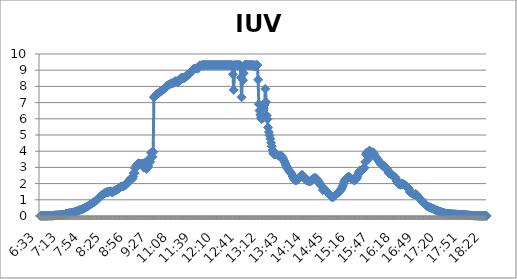
| Category | IUV (01/5) |
|---|---|
| 0.27291666666666664 | 0.009 |
| 0.2736111111111111 | 0.009 |
| 0.2743055555555555 | 0.009 |
| 0.275 | 0.009 |
| 0.27569444444444446 | 0.009 |
| 0.27638888888888885 | 0.009 |
| 0.27708333333333335 | 0.009 |
| 0.2777777777777778 | 0.009 |
| 0.27847222222222223 | 0.009 |
| 0.2791666666666667 | 0.009 |
| 0.2798611111111111 | 0.009 |
| 0.28055555555555556 | 0.019 |
| 0.28125 | 0.019 |
| 0.28194444444444444 | 0.019 |
| 0.2826388888888889 | 0.019 |
| 0.2833333333333333 | 0.019 |
| 0.28402777777777777 | 0.019 |
| 0.2847222222222222 | 0.019 |
| 0.28541666666666665 | 0.019 |
| 0.28611111111111115 | 0.028 |
| 0.2923611111111111 | 0.037 |
| 0.29305555555555557 | 0.047 |
| 0.29375 | 0.047 |
| 0.29444444444444445 | 0.047 |
| 0.2951388888888889 | 0.047 |
| 0.29583333333333334 | 0.056 |
| 0.2972222222222222 | 0.056 |
| 0.29791666666666666 | 0.065 |
| 0.2986111111111111 | 0.065 |
| 0.29930555555555555 | 0.075 |
| 0.3 | 0.075 |
| 0.30069444444444443 | 0.075 |
| 0.3013888888888889 | 0.084 |
| 0.3020833333333333 | 0.084 |
| 0.30277777777777776 | 0.084 |
| 0.3090277777777778 | 0.14 |
| 0.30972222222222223 | 0.149 |
| 0.3104166666666667 | 0.149 |
| 0.3111111111111111 | 0.158 |
| 0.31180555555555556 | 0.168 |
| 0.3125 | 0.177 |
| 0.31319444444444444 | 0.177 |
| 0.3138888888888889 | 0.186 |
| 0.3145833333333333 | 0.196 |
| 0.31527777777777777 | 0.205 |
| 0.3159722222222222 | 0.214 |
| 0.31666666666666665 | 0.224 |
| 0.31736111111111115 | 0.233 |
| 0.31805555555555554 | 0.252 |
| 0.3201388888888889 | 0.28 |
| 0.32083333333333336 | 0.289 |
| 0.3215277777777778 | 0.298 |
| 0.32222222222222224 | 0.317 |
| 0.3229166666666667 | 0.336 |
| 0.3236111111111111 | 0.354 |
| 0.32430555555555557 | 0.373 |
| 0.325 | 0.391 |
| 0.32569444444444445 | 0.401 |
| 0.3263888888888889 | 0.419 |
| 0.32708333333333334 | 0.438 |
| 0.3277777777777778 | 0.457 |
| 0.3284722222222222 | 0.485 |
| 0.32916666666666666 | 0.503 |
| 0.3298611111111111 | 0.531 |
| 0.33055555555555555 | 0.55 |
| 0.33125 | 0.578 |
| 0.33194444444444443 | 0.606 |
| 0.3326388888888889 | 0.634 |
| 0.3333333333333333 | 0.662 |
| 0.3340277777777778 | 0.699 |
| 0.3347222222222222 | 0.727 |
| 0.3354166666666667 | 0.755 |
| 0.3361111111111111 | 0.783 |
| 0.3368055555555556 | 0.811 |
| 0.3375 | 0.839 |
| 0.33819444444444446 | 0.876 |
| 0.33888888888888885 | 0.904 |
| 0.33958333333333335 | 0.932 |
| 0.34027777777777773 | 0.96 |
| 0.34097222222222223 | 1.007 |
| 0.3416666666666666 | 1.062 |
| 0.3423611111111111 | 1.109 |
| 0.3430555555555555 | 1.156 |
| 0.34375 | 1.193 |
| 0.3444444444444445 | 1.24 |
| 0.3451388888888889 | 1.277 |
| 0.3458333333333334 | 1.305 |
| 0.34652777777777777 | 1.333 |
| 0.34722222222222227 | 1.351 |
| 0.34791666666666665 | 1.389 |
| 0.34861111111111115 | 1.426 |
| 0.34930555555555554 | 1.445 |
| 0.35 | 1.463 |
| 0.3506944444444444 | 1.491 |
| 0.3513888888888889 | 1.473 |
| 0.3520833333333333 | 1.473 |
| 0.3527777777777778 | 1.501 |
| 0.3534722222222222 | 1.528 |
| 0.3541666666666667 | 1.519 |
| 0.3548611111111111 | 1.482 |
| 0.35555555555555557 | 1.473 |
| 0.35625 | 1.482 |
| 0.35694444444444445 | 1.51 |
| 0.3576388888888889 | 1.556 |
| 0.35833333333333334 | 1.575 |
| 0.3590277777777778 | 1.603 |
| 0.3597222222222222 | 1.622 |
| 0.36041666666666666 | 1.622 |
| 0.3611111111111111 | 1.65 |
| 0.36180555555555555 | 1.715 |
| 0.3625 | 1.734 |
| 0.36319444444444443 | 1.78 |
| 0.3638888888888889 | 1.808 |
| 0.3645833333333333 | 1.836 |
| 0.3652777777777778 | 1.817 |
| 0.3659722222222222 | 1.817 |
| 0.3666666666666667 | 1.845 |
| 0.3673611111111111 | 1.883 |
| 0.3680555555555556 | 1.911 |
| 0.36875 | 1.929 |
| 0.36944444444444446 | 1.957 |
| 0.37013888888888885 | 2.078 |
| 0.37083333333333335 | 2.116 |
| 0.37152777777777773 | 2.144 |
| 0.37222222222222223 | 2.19 |
| 0.3729166666666666 | 2.283 |
| 0.3736111111111111 | 2.321 |
| 0.3743055555555555 | 2.274 |
| 0.375 | 2.302 |
| 0.3756944444444445 | 2.423 |
| 0.3763888888888889 | 2.647 |
| 0.3770833333333334 | 2.638 |
| 0.37777777777777777 | 2.936 |
| 0.37847222222222227 | 3.076 |
| 0.37916666666666665 | 3.094 |
| 0.37986111111111115 | 3.197 |
| 0.38055555555555554 | 3.243 |
| 0.38125 | 3.253 |
| 0.3819444444444444 | 3.197 |
| 0.3826388888888889 | 3.178 |
| 0.3833333333333333 | 3.234 |
| 0.3840277777777778 | 3.178 |
| 0.3847222222222222 | 3.234 |
| 0.3854166666666667 | 3.253 |
| 0.3861111111111111 | 2.982 |
| 0.38680555555555557 | 3.271 |
| 0.3875 | 3.029 |
| 0.38819444444444445 | 2.936 |
| 0.3888888888888889 | 2.908 |
| 0.38958333333333334 | 2.982 |
| 0.3902777777777778 | 3.085 |
| 0.3909722222222222 | 3.467 |
| 0.39166666666666666 | 3.551 |
| 0.3923611111111111 | 3.346 |
| 0.39305555555555555 | 3.905 |
| 0.39375 | 3.886 |
| 0.39444444444444443 | 3.653 |
| 0.3951388888888889 | 3.961 |
| 0.4444444444444444 | 7.335 |
| 0.4451388888888889 | 7.372 |
| 0.4458333333333333 | 7.4 |
| 0.4465277777777778 | 7.456 |
| 0.4472222222222222 | 7.512 |
| 0.4479166666666667 | 7.559 |
| 0.4486111111111111 | 7.577 |
| 0.44930555555555557 | 7.596 |
| 0.45 | 7.661 |
| 0.45069444444444445 | 7.68 |
| 0.4513888888888889 | 7.698 |
| 0.45208333333333334 | 7.745 |
| 0.4527777777777778 | 7.773 |
| 0.4534722222222222 | 7.801 |
| 0.45416666666666666 | 7.857 |
| 0.4548611111111111 | 7.894 |
| 0.45555555555555555 | 7.931 |
| 0.45625 | 7.969 |
| 0.45694444444444443 | 8.006 |
| 0.4576388888888889 | 8.052 |
| 0.4583333333333333 | 8.09 |
| 0.4590277777777778 | 8.108 |
| 0.4597222222222222 | 8.127 |
| 0.4604166666666667 | 8.155 |
| 0.4611111111111111 | 8.192 |
| 0.4618055555555556 | 8.192 |
| 0.4625 | 8.183 |
| 0.46319444444444446 | 8.22 |
| 0.46388888888888885 | 8.258 |
| 0.46458333333333335 | 8.295 |
| 0.46527777777777773 | 8.323 |
| 0.46597222222222223 | 8.313 |
| 0.4666666666666666 | 8.313 |
| 0.4673611111111111 | 8.285 |
| 0.4680555555555555 | 8.267 |
| 0.46875 | 8.304 |
| 0.4694444444444445 | 8.369 |
| 0.4701388888888889 | 8.472 |
| 0.4708333333333334 | 8.528 |
| 0.47152777777777777 | 8.546 |
| 0.47222222222222227 | 8.537 |
| 0.47291666666666665 | 8.518 |
| 0.47361111111111115 | 8.509 |
| 0.47430555555555554 | 8.537 |
| 0.475 | 8.565 |
| 0.4756944444444444 | 8.602 |
| 0.4763888888888889 | 8.677 |
| 0.4770833333333333 | 8.742 |
| 0.4777777777777778 | 8.77 |
| 0.4784722222222222 | 8.751 |
| 0.4791666666666667 | 8.798 |
| 0.4798611111111111 | 8.891 |
| 0.48055555555555557 | 8.938 |
| 0.48125 | 8.975 |
| 0.48194444444444445 | 9.012 |
| 0.4826388888888889 | 9.059 |
| 0.48333333333333334 | 9.087 |
| 0.4840277777777778 | 9.106 |
| 0.4847222222222222 | 9.096 |
| 0.48541666666666666 | 9.115 |
| 0.4861111111111111 | 9.124 |
| 0.48680555555555555 | 9.096 |
| 0.4875 | 9.124 |
| 0.48819444444444443 | 9.255 |
| 0.4888888888888889 | 9.301 |
| 0.4895833333333333 | 9.283 |
| 0.4902777777777778 | 9.292 |
| 0.4909722222222222 | 9.32 |
| 0.4916666666666667 | 9.32 |
| 0.4923611111111111 | 9.32 |
| 0.4930555555555556 | 9.32 |
| 0.49375 | 9.32 |
| 0.49444444444444446 | 9.32 |
| 0.49513888888888885 | 9.32 |
| 0.49583333333333335 | 9.32 |
| 0.49652777777777773 | 9.32 |
| 0.49722222222222223 | 9.32 |
| 0.4979166666666666 | 9.32 |
| 0.4986111111111111 | 9.32 |
| 0.4993055555555555 | 9.32 |
| 0.5 | 9.32 |
| 0.5006944444444444 | 9.32 |
| 0.5013888888888889 | 9.32 |
| 0.5020833333333333 | 9.32 |
| 0.5027777777777778 | 9.32 |
| 0.5034722222222222 | 9.32 |
| 0.5041666666666667 | 9.32 |
| 0.5048611111111111 | 9.32 |
| 0.5055555555555555 | 9.32 |
| 0.50625 | 9.32 |
| 0.5069444444444444 | 9.32 |
| 0.5076388888888889 | 9.32 |
| 0.5083333333333333 | 9.32 |
| 0.5090277777777777 | 9.32 |
| 0.5097222222222222 | 9.32 |
| 0.5104166666666666 | 9.32 |
| 0.5111111111111112 | 9.32 |
| 0.5118055555555555 | 9.32 |
| 0.5125 | 9.32 |
| 0.5131944444444444 | 9.32 |
| 0.513888888888889 | 9.32 |
| 0.5145833333333333 | 9.32 |
| 0.5152777777777778 | 9.32 |
| 0.5159722222222222 | 9.32 |
| 0.5166666666666667 | 9.32 |
| 0.517361111111111 | 9.32 |
| 0.5180555555555556 | 9.32 |
| 0.51875 | 9.32 |
| 0.5194444444444445 | 9.32 |
| 0.5201388888888888 | 9.32 |
| 0.5208333333333334 | 8.751 |
| 0.5215277777777778 | 7.782 |
| 0.5222222222222223 | 9.32 |
| 0.5229166666666667 | 9.32 |
| 0.5236111111111111 | 9.32 |
| 0.5243055555555556 | 9.32 |
| 0.525 | 9.32 |
| 0.5256944444444445 | 9.32 |
| 0.5263888888888889 | 9.32 |
| 0.5270833333333333 | 9.32 |
| 0.5277777777777778 | 9.32 |
| 0.5284722222222222 | 8.546 |
| 0.5291666666666667 | 7.335 |
| 0.5298611111111111 | 9.208 |
| 0.5305555555555556 | 8.379 |
| 0.53125 | 8.807 |
| 0.5319444444444444 | 9.32 |
| 0.5326388888888889 | 9.32 |
| 0.5333333333333333 | 9.32 |
| 0.5340277777777778 | 9.32 |
| 0.5347222222222222 | 9.32 |
| 0.5354166666666667 | 9.32 |
| 0.5361111111111111 | 9.32 |
| 0.5368055555555555 | 9.32 |
| 0.5375 | 9.32 |
| 0.5381944444444444 | 9.32 |
| 0.5388888888888889 | 9.32 |
| 0.5395833333333333 | 9.32 |
| 0.5402777777777777 | 9.32 |
| 0.5409722222222222 | 9.32 |
| 0.5416666666666666 | 9.217 |
| 0.5423611111111112 | 9.227 |
| 0.5430555555555555 | 9.32 |
| 0.54375 | 9.32 |
| 0.5444444444444444 | 9.32 |
| 0.545138888888889 | 8.407 |
| 0.5458333333333333 | 6.906 |
| 0.5465277777777778 | 6.505 |
| 0.5472222222222222 | 6.244 |
| 0.5479166666666667 | 6.086 |
| 0.548611111111111 | 5.974 |
| 0.5493055555555556 | 6.039 |
| 0.55 | 6.878 |
| 0.5506944444444445 | 6.645 |
| 0.5513888888888888 | 6.85 |
| 0.5520833333333334 | 7.847 |
| 0.5527777777777778 | 7.037 |
| 0.5534722222222223 | 6.207 |
| 0.5541666666666667 | 5.974 |
| 0.5548611111111111 | 5.462 |
| 0.5555555555555556 | 5.182 |
| 0.55625 | 4.977 |
| 0.5569444444444445 | 4.772 |
| 0.5576388888888889 | 4.52 |
| 0.5583333333333333 | 4.306 |
| 0.5590277777777778 | 4.073 |
| 0.5597222222222222 | 3.886 |
| 0.5604166666666667 | 3.812 |
| 0.5611111111111111 | 3.812 |
| 0.5618055555555556 | 3.831 |
| 0.5625 | 3.831 |
| 0.5631944444444444 | 3.812 |
| 0.5638888888888889 | 3.765 |
| 0.5645833333333333 | 3.728 |
| 0.5652777777777778 | 3.7 |
| 0.5659722222222222 | 3.7 |
| 0.5666666666666667 | 3.728 |
| 0.5673611111111111 | 3.737 |
| 0.5680555555555555 | 3.691 |
| 0.56875 | 3.607 |
| 0.5694444444444444 | 3.514 |
| 0.5701388888888889 | 3.42 |
| 0.5708333333333333 | 3.318 |
| 0.5715277777777777 | 3.215 |
| 0.5722222222222222 | 3.122 |
| 0.5729166666666666 | 3.029 |
| 0.5736111111111112 | 2.945 |
| 0.5743055555555555 | 2.88 |
| 0.575 | 2.815 |
| 0.5756944444444444 | 2.749 |
| 0.576388888888889 | 2.693 |
| 0.5770833333333333 | 2.638 |
| 0.5777777777777778 | 2.563 |
| 0.5784722222222222 | 2.47 |
| 0.5791666666666667 | 2.367 |
| 0.579861111111111 | 2.283 |
| 0.5805555555555556 | 2.227 |
| 0.58125 | 2.2 |
| 0.5819444444444445 | 2.2 |
| 0.5826388888888888 | 2.227 |
| 0.5833333333333334 | 2.255 |
| 0.5840277777777778 | 2.293 |
| 0.5847222222222223 | 2.349 |
| 0.5854166666666667 | 2.405 |
| 0.5861111111111111 | 2.47 |
| 0.5868055555555556 | 2.516 |
| 0.5875 | 2.526 |
| 0.5881944444444445 | 2.516 |
| 0.5888888888888889 | 2.46 |
| 0.5895833333333333 | 2.395 |
| 0.5902777777777778 | 2.311 |
| 0.5909722222222222 | 2.246 |
| 0.5916666666666667 | 2.209 |
| 0.5923611111111111 | 2.19 |
| 0.5930555555555556 | 2.172 |
| 0.59375 | 2.162 |
| 0.5944444444444444 | 2.144 |
| 0.5951388888888889 | 2.134 |
| 0.5958333333333333 | 2.144 |
| 0.5965277777777778 | 2.181 |
| 0.5972222222222222 | 2.227 |
| 0.5979166666666667 | 2.274 |
| 0.5986111111111111 | 2.311 |
| 0.5993055555555555 | 2.339 |
| 0.6 | 2.349 |
| 0.6006944444444444 | 2.339 |
| 0.6013888888888889 | 2.311 |
| 0.6020833333333333 | 2.265 |
| 0.6027777777777777 | 2.2 |
| 0.6034722222222222 | 2.125 |
| 0.6041666666666666 | 2.041 |
| 0.6048611111111112 | 1.976 |
| 0.6055555555555555 | 1.911 |
| 0.60625 | 1.855 |
| 0.6069444444444444 | 1.808 |
| 0.607638888888889 | 1.603 |
| 0.6083333333333333 | 1.734 |
| 0.6090277777777778 | 1.687 |
| 0.6097222222222222 | 1.64 |
| 0.6104166666666667 | 1.594 |
| 0.611111111111111 | 1.538 |
| 0.6118055555555556 | 1.491 |
| 0.6125 | 1.445 |
| 0.6131944444444445 | 1.389 |
| 0.6138888888888888 | 1.333 |
| 0.6145833333333334 | 1.277 |
| 0.6152777777777778 | 1.221 |
| 0.6159722222222223 | 1.184 |
| 0.6166666666666667 | 1.165 |
| 0.6173611111111111 | 1.165 |
| 0.6180555555555556 | 1.184 |
| 0.61875 | 1.221 |
| 0.6194444444444445 | 1.258 |
| 0.6201388888888889 | 1.305 |
| 0.6208333333333333 | 1.351 |
| 0.6215277777777778 | 1.389 |
| 0.6222222222222222 | 1.426 |
| 0.6229166666666667 | 1.463 |
| 0.6236111111111111 | 1.51 |
| 0.6243055555555556 | 1.556 |
| 0.625 | 1.612 |
| 0.6256944444444444 | 1.687 |
| 0.6263888888888889 | 1.78 |
| 0.6270833333333333 | 1.892 |
| 0.6277777777777778 | 2.013 |
| 0.6284722222222222 | 2.125 |
| 0.6291666666666667 | 2.218 |
| 0.6298611111111111 | 2.293 |
| 0.6305555555555555 | 2.339 |
| 0.63125 | 2.377 |
| 0.6319444444444444 | 2.405 |
| 0.6326388888888889 | 2.414 |
| 0.6333333333333333 | 2.405 |
| 0.6340277777777777 | 2.367 |
| 0.6347222222222222 | 2.33 |
| 0.6354166666666666 | 2.293 |
| 0.6361111111111112 | 2.265 |
| 0.6368055555555555 | 2.246 |
| 0.6375 | 2.227 |
| 0.6381944444444444 | 2.209 |
| 0.638888888888889 | 2.218 |
| 0.6395833333333333 | 2.255 |
| 0.6402777777777778 | 2.311 |
| 0.6409722222222222 | 2.423 |
| 0.6416666666666667 | 2.554 |
| 0.642361111111111 | 2.693 |
| 0.6430555555555556 | 2.777 |
| 0.64375 | 2.815 |
| 0.6444444444444445 | 2.805 |
| 0.6451388888888888 | 2.805 |
| 0.6458333333333334 | 2.843 |
| 0.6465277777777778 | 2.899 |
| 0.6472222222222223 | 2.945 |
| 0.6479166666666667 | 2.982 |
| 0.6486111111111111 | 3.337 |
| 0.6493055555555556 | 3.793 |
| 0.65 | 3.914 |
| 0.6506944444444445 | 3.84 |
| 0.6513888888888889 | 3.476 |
| 0.6520833333333333 | 3.924 |
| 0.6527777777777778 | 4.045 |
| 0.6534722222222222 | 3.952 |
| 0.6541666666666667 | 3.933 |
| 0.6548611111111111 | 3.924 |
| 0.6555555555555556 | 3.924 |
| 0.65625 | 3.933 |
| 0.6569444444444444 | 3.877 |
| 0.6576388888888889 | 3.765 |
| 0.6583333333333333 | 3.681 |
| 0.6590277777777778 | 3.625 |
| 0.6597222222222222 | 3.579 |
| 0.6604166666666667 | 3.523 |
| 0.6611111111111111 | 3.458 |
| 0.6618055555555555 | 3.392 |
| 0.6625 | 3.337 |
| 0.6631944444444444 | 3.262 |
| 0.6638888888888889 | 3.187 |
| 0.6645833333333333 | 3.132 |
| 0.6652777777777777 | 3.104 |
| 0.6659722222222222 | 3.094 |
| 0.6666666666666666 | 3.094 |
| 0.6673611111111111 | 3.076 |
| 0.6680555555555556 | 3.029 |
| 0.66875 | 2.982 |
| 0.6694444444444444 | 2.926 |
| 0.6701388888888888 | 2.852 |
| 0.6708333333333334 | 2.74 |
| 0.6715277777777778 | 2.638 |
| 0.6722222222222222 | 2.628 |
| 0.6729166666666666 | 2.582 |
| 0.6736111111111112 | 2.572 |
| 0.6743055555555556 | 2.554 |
| 0.675 | 2.516 |
| 0.6756944444444444 | 2.479 |
| 0.6763888888888889 | 2.451 |
| 0.6770833333333334 | 2.414 |
| 0.6777777777777777 | 2.377 |
| 0.6784722222222223 | 2.265 |
| 0.6791666666666667 | 2.144 |
| 0.6798611111111111 | 2.032 |
| 0.6805555555555555 | 1.985 |
| 0.68125 | 1.985 |
| 0.6819444444444445 | 1.939 |
| 0.6826388888888889 | 1.929 |
| 0.6833333333333332 | 1.948 |
| 0.6840277777777778 | 2.013 |
| 0.6847222222222222 | 1.976 |
| 0.6854166666666667 | 1.967 |
| 0.686111111111111 | 1.948 |
| 0.6868055555555556 | 1.929 |
| 0.6875 | 1.883 |
| 0.6881944444444444 | 1.855 |
| 0.688888888888889 | 1.808 |
| 0.6895833333333333 | 1.761 |
| 0.6902777777777778 | 1.724 |
| 0.6909722222222222 | 1.65 |
| 0.6916666666666668 | 1.491 |
| 0.6923611111111111 | 1.454 |
| 0.6930555555555555 | 1.435 |
| 0.69375 | 1.426 |
| 0.6944444444444445 | 1.379 |
| 0.6951388888888889 | 1.351 |
| 0.6958333333333333 | 1.323 |
| 0.6965277777777777 | 1.323 |
| 0.6972222222222223 | 1.361 |
| 0.6979166666666666 | 1.333 |
| 0.6986111111111111 | 1.286 |
| 0.6993055555555556 | 1.23 |
| 0.7 | 1.174 |
| 0.7006944444444444 | 1.109 |
| 0.7013888888888888 | 1.072 |
| 0.7020833333333334 | 1.035 |
| 0.7027777777777778 | 0.997 |
| 0.7034722222222222 | 0.941 |
| 0.7041666666666666 | 0.848 |
| 0.7048611111111112 | 0.802 |
| 0.7055555555555556 | 0.764 |
| 0.70625 | 0.727 |
| 0.7069444444444444 | 0.68 |
| 0.7076388888888889 | 0.643 |
| 0.7083333333333334 | 0.615 |
| 0.7090277777777777 | 0.596 |
| 0.7097222222222223 | 0.569 |
| 0.7104166666666667 | 0.55 |
| 0.7111111111111111 | 0.531 |
| 0.7118055555555555 | 0.513 |
| 0.7125 | 0.494 |
| 0.7131944444444445 | 0.475 |
| 0.7138888888888889 | 0.457 |
| 0.7145833333333332 | 0.438 |
| 0.7152777777777778 | 0.419 |
| 0.7159722222222222 | 0.391 |
| 0.7166666666666667 | 0.373 |
| 0.717361111111111 | 0.354 |
| 0.7180555555555556 | 0.336 |
| 0.71875 | 0.317 |
| 0.7194444444444444 | 0.308 |
| 0.720138888888889 | 0.289 |
| 0.7208333333333333 | 0.27 |
| 0.7215277777777778 | 0.261 |
| 0.7222222222222222 | 0.242 |
| 0.7229166666666668 | 0.224 |
| 0.7236111111111111 | 0.205 |
| 0.7243055555555555 | 0.196 |
| 0.725 | 0.177 |
| 0.7256944444444445 | 0.168 |
| 0.7263888888888889 | 0.158 |
| 0.7270833333333333 | 0.149 |
| 0.7277777777777777 | 0.149 |
| 0.7284722222222223 | 0.14 |
| 0.7291666666666666 | 0.13 |
| 0.7298611111111111 | 0.13 |
| 0.7305555555555556 | 0.121 |
| 0.73125 | 0.121 |
| 0.7319444444444444 | 0.121 |
| 0.7326388888888888 | 0.121 |
| 0.7333333333333334 | 0.112 |
| 0.7340277777777778 | 0.112 |
| 0.7347222222222222 | 0.112 |
| 0.7354166666666666 | 0.103 |
| 0.7361111111111112 | 0.103 |
| 0.7368055555555556 | 0.103 |
| 0.7375 | 0.093 |
| 0.7381944444444444 | 0.093 |
| 0.7388888888888889 | 0.084 |
| 0.7395833333333334 | 0.084 |
| 0.7402777777777777 | 0.084 |
| 0.7409722222222223 | 0.084 |
| 0.7416666666666667 | 0.084 |
| 0.7423611111111111 | 0.084 |
| 0.7430555555555555 | 0.075 |
| 0.74375 | 0.075 |
| 0.7444444444444445 | 0.075 |
| 0.7451388888888889 | 0.065 |
| 0.7458333333333332 | 0.065 |
| 0.7465277777777778 | 0.056 |
| 0.7472222222222222 | 0.056 |
| 0.7479166666666667 | 0.047 |
| 0.748611111111111 | 0.047 |
| 0.7493055555555556 | 0.037 |
| 0.75 | 0.037 |
| 0.7506944444444444 | 0.037 |
| 0.751388888888889 | 0.028 |
| 0.7520833333333333 | 0.028 |
| 0.7527777777777778 | 0.028 |
| 0.7534722222222222 | 0.028 |
| 0.7541666666666668 | 0.019 |
| 0.7548611111111111 | 0.019 |
| 0.7555555555555555 | 0.019 |
| 0.75625 | 0.019 |
| 0.7569444444444445 | 0.019 |
| 0.7576388888888889 | 0.019 |
| 0.7583333333333333 | 0.009 |
| 0.7590277777777777 | 0.009 |
| 0.7597222222222223 | 0.009 |
| 0.7604166666666666 | 0.009 |
| 0.7611111111111111 | 0.009 |
| 0.7618055555555556 | 0.009 |
| 0.7625 | 0.009 |
| 0.7631944444444444 | 0.009 |
| 0.7638888888888888 | 0.009 |
| 0.7645833333333334 | 0.009 |
| 0.7652777777777778 | 0.009 |
| 0.7659722222222222 | 0.009 |